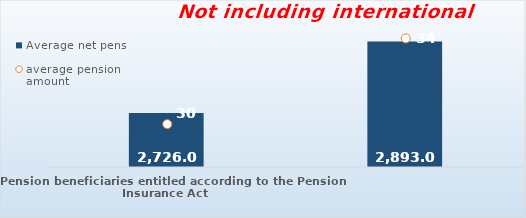
| Category | Average net pension  |
|---|---|
| Pension beneficiaries entitled according to the Pension Insurance Act   | 2726.06 |
| Pension beneficiaries entitled to pension FOR THE FIRST TIME in 2019 according to the Pension Insurance Act  - NEW BENEFICIARIES | 2893.049 |